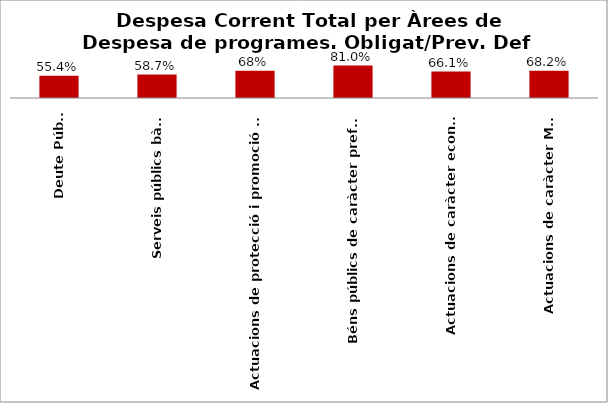
| Category | Series 0 |
|---|---|
| Deute Públic | 0.554 |
| Serveis públics bàsics | 0.587 |
| Actuacions de protecció i promoció social | 0.683 |
| Béns públics de caràcter preferent | 0.81 |
| Actuacions de caràcter econòmic | 0.661 |
| Actuacions de caràcter Marçal | 0.682 |